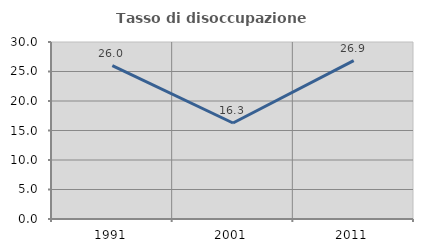
| Category | Tasso di disoccupazione giovanile  |
|---|---|
| 1991.0 | 26 |
| 2001.0 | 16.274 |
| 2011.0 | 26.857 |